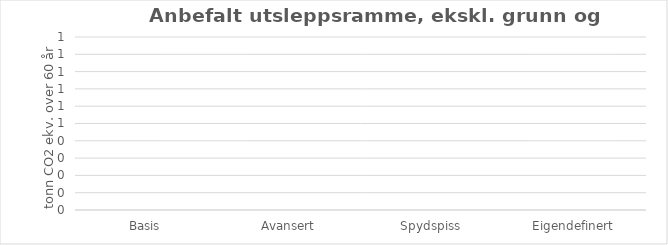
| Category | Tonn CO2-ekv. over 60 år |
|---|---|
| Basis | 0 |
| Avansert | 0 |
| Spydspiss | 0 |
| Eigendefinert | 0 |